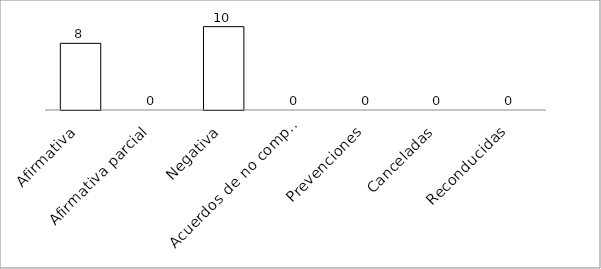
| Category | Series 0 |
|---|---|
| Afirmativa | 8 |
| Afirmativa parcial | 0 |
| Negativa | 10 |
| Acuerdos de no competencia | 0 |
| Prevenciones | 0 |
| Canceladas | 0 |
| Reconducidas | 0 |